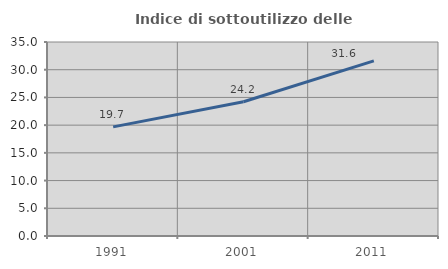
| Category | Indice di sottoutilizzo delle abitazioni  |
|---|---|
| 1991.0 | 19.687 |
| 2001.0 | 24.229 |
| 2011.0 | 31.599 |